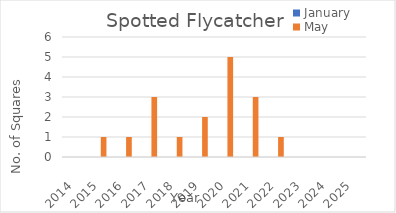
| Category | January | May |
|---|---|---|
| 2014.0 | 0 | 0 |
| 2015.0 | 0 | 1 |
| 2016.0 | 0 | 1 |
| 2017.0 | 0 | 3 |
| 2018.0 | 0 | 1 |
| 2019.0 | 0 | 2 |
| 2020.0 | 0 | 5 |
| 2021.0 | 0 | 3 |
| 2022.0 | 0 | 1 |
| 2023.0 | 0 | 0 |
| 2024.0 | 0 | 0 |
| 2025.0 | 0 | 0 |